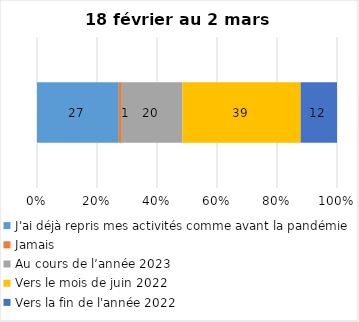
| Category | J'ai déjà repris mes activités comme avant la pandémie | Jamais | Au cours de l’année 2023 | Vers le mois de juin 2022 | Vers la fin de l'année 2022 |
|---|---|---|---|---|---|
| 0 | 27 | 1 | 20 | 39 | 12 |